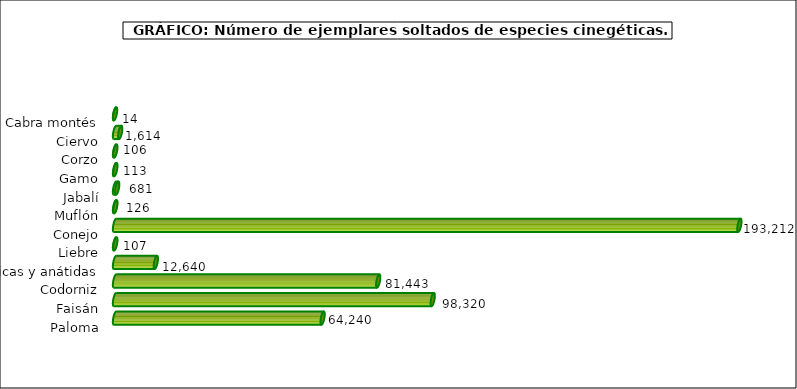
| Category | Series 1 |
|---|---|
| Cabra montés | 14 |
| Ciervo | 1614 |
| Corzo | 106 |
| Gamo | 113 |
| Jabalí | 681 |
| Muflón | 126 |
| Conejo | 193212 |
| Liebre | 107 |
| Acuáticas y anátidas | 12640 |
| Codorniz | 81443 |
| Faisán | 98320 |
| Paloma | 64240 |